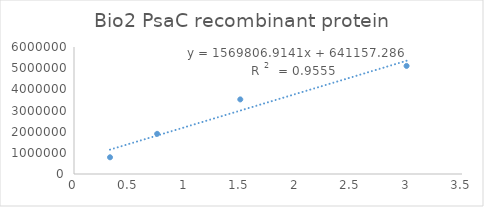
| Category | Series 0 |
|---|---|
| 3.0 | 5106170.21 |
| 1.5 | 3523887.85 |
| 0.75 | 1897023.5 |
| 0.325 | 789221.13 |